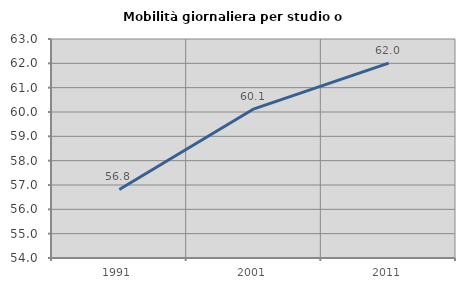
| Category | Mobilità giornaliera per studio o lavoro |
|---|---|
| 1991.0 | 56.818 |
| 2001.0 | 60.131 |
| 2011.0 | 62.011 |